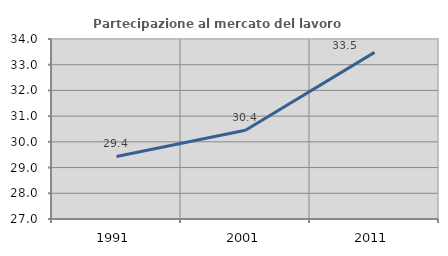
| Category | Partecipazione al mercato del lavoro  femminile |
|---|---|
| 1991.0 | 29.432 |
| 2001.0 | 30.449 |
| 2011.0 | 33.48 |